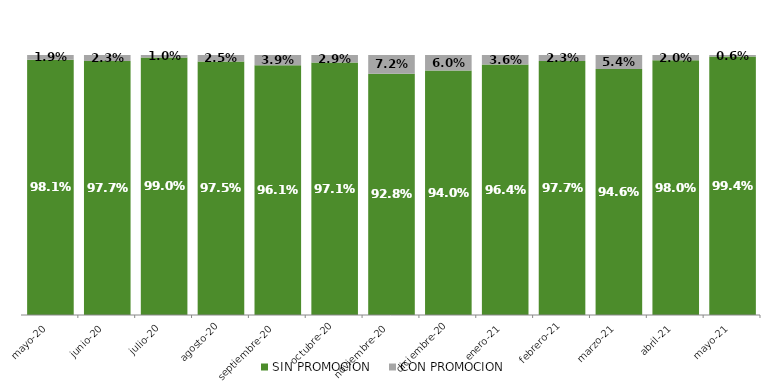
| Category | SIN PROMOCION   | CON PROMOCION   |
|---|---|---|
| 2020-05-01 | 0.981 | 0.019 |
| 2020-06-01 | 0.977 | 0.023 |
| 2020-07-01 | 0.99 | 0.01 |
| 2020-08-01 | 0.975 | 0.025 |
| 2020-09-01 | 0.961 | 0.039 |
| 2020-10-01 | 0.971 | 0.029 |
| 2020-11-01 | 0.928 | 0.072 |
| 2020-12-01 | 0.94 | 0.06 |
| 2021-01-01 | 0.964 | 0.036 |
| 2021-02-01 | 0.977 | 0.023 |
| 2021-03-01 | 0.946 | 0.054 |
| 2021-04-01 | 0.98 | 0.02 |
| 2021-05-01 | 0.994 | 0.006 |